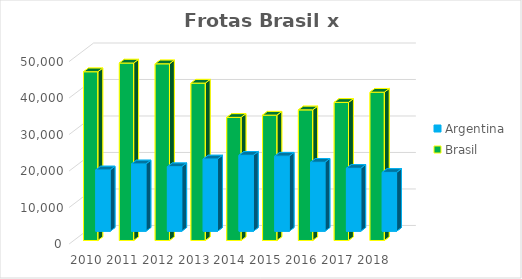
| Category | Argentina | Brasil |
|---|---|---|
| 2010.0 | 16795 | 46243 |
| 2011.0 | 18446 | 48633 |
| 2012.0 | 17682 | 48419 |
| 2013.0 | 19801 | 43130 |
| 2014.0 | 20821 | 33742 |
| 2015.0 | 20576 | 34352 |
| 2016.0 | 18905 | 35795 |
| 2017.0 | 17244 | 37854 |
| 2018.0 | 16122 | 40641 |